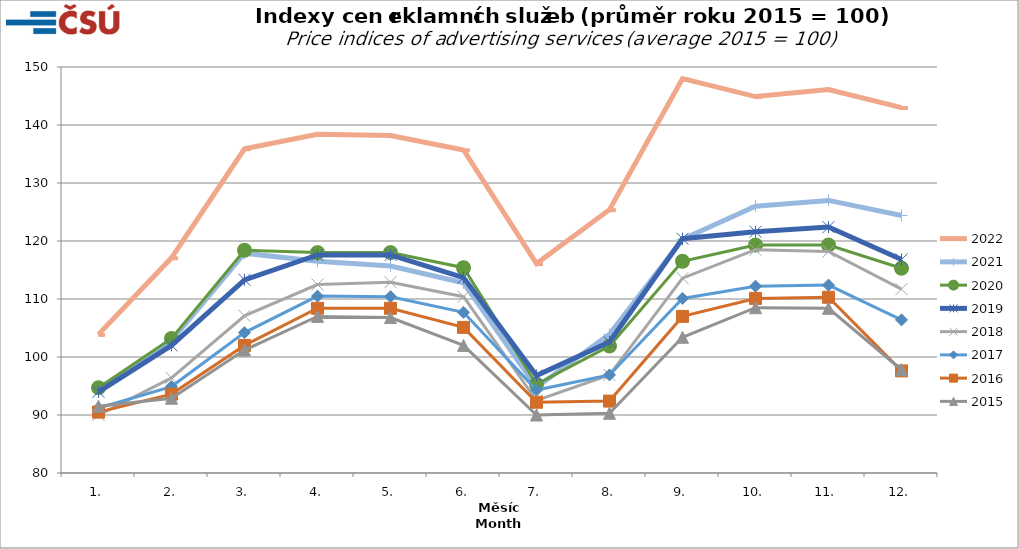
| Category | 2022 | 2021 | 2020 | 2019 | 2018 | 2017 | 2016 | 2015 |
|---|---|---|---|---|---|---|---|---|
| 1. | 103.9 | 94.1 | 94.7 | 94 | 90 | 91.2 | 90.5 | 91.5 |
| 2. | 117.1 | 102.8 | 103.2 | 102 | 96.4 | 94.9 | 93.6 | 92.9 |
| 3. | 135.9 | 117.9 | 118.4 | 113.3 | 107.1 | 104.2 | 102 | 101.2 |
| 4. | 138.4 | 116.5 | 118 | 117.6 | 112.5 | 110.5 | 108.4 | 107 |
| 5. | 138.2 | 115.7 | 118 | 117.6 | 112.9 | 110.4 | 108.4 | 106.8 |
| 6. | 135.7 | 112.8 | 115.4 | 113.7 | 110.4 | 107.7 | 105.1 | 102 |
| 7. | 116.1 | 94.8 | 95.3 | 96.8 | 92.5 | 94.3 | 92.2 | 90 |
| 8. | 125.4 | 103.9 | 101.9 | 102.6 | 96.9 | 96.9 | 92.4 | 90.3 |
| 9. | 148 | 120.3 | 116.5 | 120.4 | 113.6 | 110.1 | 107 | 103.4 |
| 10. | 144.9 | 126 | 119.3 | 121.6 | 118.5 | 112.2 | 110.1 | 108.5 |
| 11. | 146.1 | 127 | 119.3 | 122.4 | 118.2 | 112.4 | 110.3 | 108.4 |
| 12. | 143 | 124.4 | 115.3 | 116.8 | 111.7 | 106.4 | 97.6 | 97.8 |